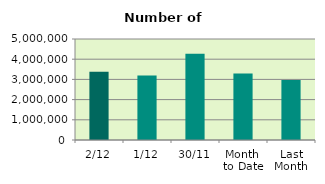
| Category | Series 0 |
|---|---|
| 2/12 | 3377688 |
| 1/12 | 3194590 |
| 30/11 | 4270684 |
| Month 
to Date | 3286139 |
| Last
Month | 2974168.364 |